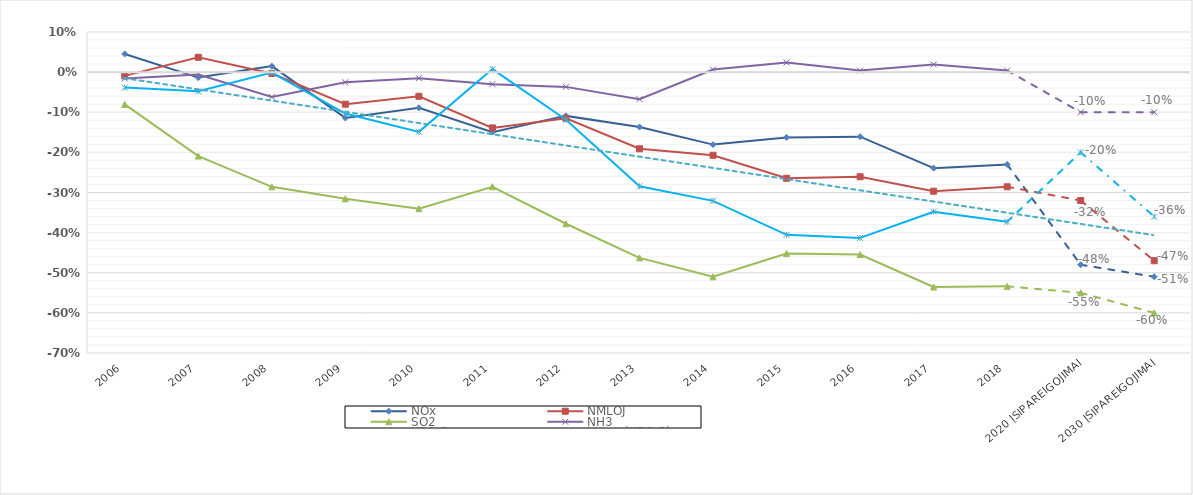
| Category | NOx | NMLOJ | SO2 | NH3 | KD2.5 |
|---|---|---|---|---|---|
| 2006 | 0.045 | -0.009 | -0.081 | -0.016 | -0.038 |
| 2007 | -0.014 | 0.037 | -0.209 | -0.006 | -0.048 |
| 2008 | 0.015 | -0.003 | -0.286 | -0.062 | -0.001 |
| 2009 | -0.114 | -0.08 | -0.316 | -0.025 | -0.103 |
| 2010 | -0.089 | -0.06 | -0.34 | -0.015 | -0.149 |
| 2011 | -0.15 | -0.139 | -0.286 | -0.03 | 0.008 |
| 2012 | -0.109 | -0.115 | -0.378 | -0.037 | -0.119 |
| 2013 | -0.137 | -0.191 | -0.463 | -0.067 | -0.284 |
| 2014 | -0.181 | -0.207 | -0.51 | 0.007 | -0.321 |
| 2015 | -0.163 | -0.265 | -0.452 | 0.024 | -0.406 |
| 2016 | -0.161 | -0.261 | -0.455 | 0.004 | -0.413 |
| 2017 | -0.239 | -0.297 | -0.536 | 0.019 | -0.348 |
| 2018 | -0.23 | -0.286 | -0.534 | 0.004 | -0.373 |
| 2020 įsipareigojimai | -0.48 | -0.32 | -0.55 | -0.1 | -0.2 |
| 2030 įsipareigojimai | -0.51 | -0.47 | -0.6 | -0.1 | -0.36 |